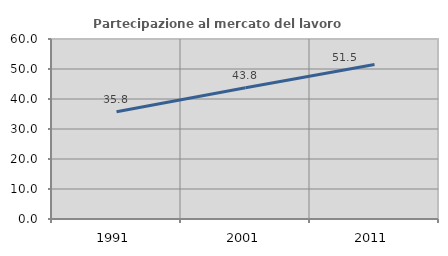
| Category | Partecipazione al mercato del lavoro  femminile |
|---|---|
| 1991.0 | 35.776 |
| 2001.0 | 43.75 |
| 2011.0 | 51.489 |